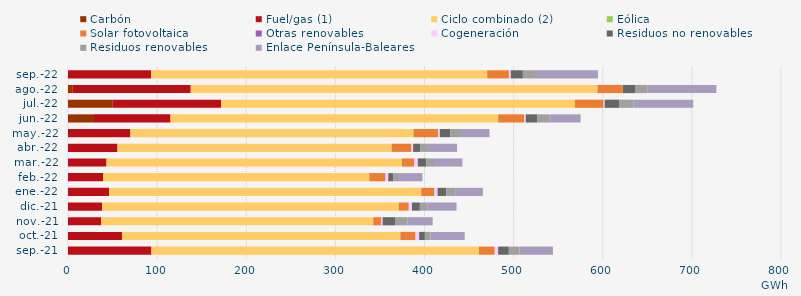
| Category | Carbón | Fuel/gas (1) | Ciclo combinado (2) | Eólica | Solar fotovoltaica | Otras renovables | Cogeneración | Residuos no renovables | Residuos renovables | Enlace Península-Baleares |
|---|---|---|---|---|---|---|---|---|---|---|
| sep.-21 | -0.55 | 93.586 | 367.241 | 0.274 | 17.622 | 0.081 | 3.819 | 11.973 | 11.973 | 37.549 |
| oct.-21 | -0.583 | 60.568 | 312.103 | 0.27 | 16.793 | 0.243 | 4.021 | 6.415 | 6.415 | 38.286 |
| nov.-21 | -0.582 | 37.046 | 305.438 | 0.061 | 8.81 | 0.24 | 1.412 | 13.868 | 13.868 | 28.436 |
| dic.-21 | -0.614 | 38.331 | 332.591 | 0.101 | 11.149 | 0.23 | 3.519 | 8.866 | 8.866 | 32.271 |
| ene.-22 | -0.627 | 46.217 | 350.083 | 0.216 | 14.435 | 0.285 | 3.401 | 9.871 | 9.871 | 31.159 |
| feb.-22 | -0.58 | 39.301 | 298.623 | 0.228 | 17.857 | 0.281 | 3.068 | 5.441 | 5.441 | 27.503 |
| mar.-22 | -0.669 | 43.218 | 331.001 | 0.338 | 13.693 | 0.291 | 3.993 | 9.663 | 9.663 | 30.689 |
| abr.-22 | -0.605 | 55.507 | 307.429 | 0.24 | 22.081 | 0.165 | 1.839 | 7.805 | 7.805 | 33.641 |
| may.-22 | -1.03 | 70.043 | 317.556 | 0.161 | 27.327 | 0.166 | 1.946 | 11.846 | 11.846 | 32.047 |
| jun.-22 | 29.142 | 85.898 | 367.588 | 0.061 | 29.226 | 0.111 | 1.536 | 13.186 | 13.186 | 35.225 |
| jul.-22 | 50.189 | 121.497 | 396.96 | 0.03 | 32.265 | 0.095 | 1.172 | 16.161 | 16.161 | 67.033 |
| ago.-22 | 5.265 | 132.464 | 456.377 | 0.032 | 28.24 | 0.057 | 0.051 | 13.672 | 13.672 | 77.653 |
| sep.-22 | -0.604 | 93.244 | 377.074 | 0.013 | 24.348 | 0.072 | 2.037 | 13.582 | 13.582 | 70.647 |